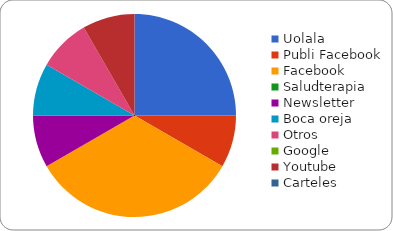
| Category | Series 0 |
|---|---|
| Uolala | 3 |
| Publi Facebook | 1 |
| Facebook | 4 |
| Saludterapia | 0 |
| Newsletter | 1 |
| Boca oreja | 1 |
| Otros | 1 |
| Google | 0 |
| Youtube | 1 |
| Carteles | 0 |